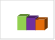
| Category | Софиийска област  |
|---|---|
| летен сезон 2019  | 245951 |
| летен сезон 2021  | 217360 |
| летен сезон 2022 г.  | 188783 |